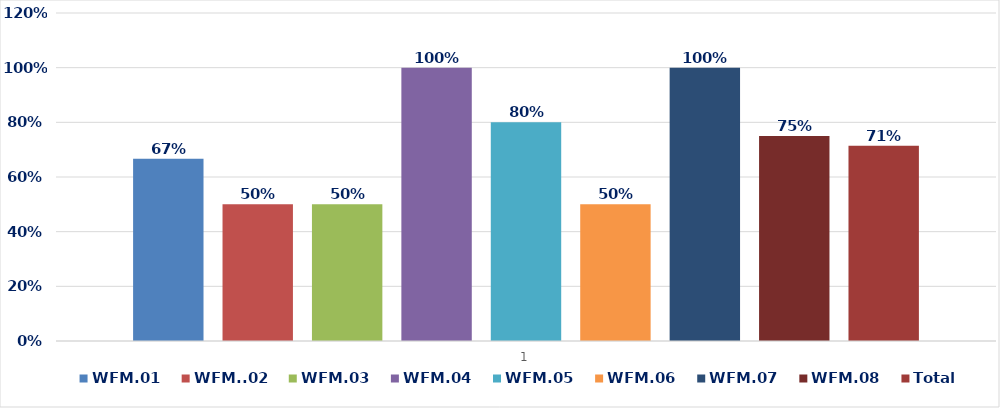
| Category | WFM.01 | WFM..02 | WFM.03 | WFM.04 | WFM.05 | WFM.06 | WFM.07 | WFM.08 | Total |
|---|---|---|---|---|---|---|---|---|---|
| 0 | 0.667 | 0.5 | 0.5 | 1 | 0.8 | 0.5 | 1 | 0.75 | 0.715 |